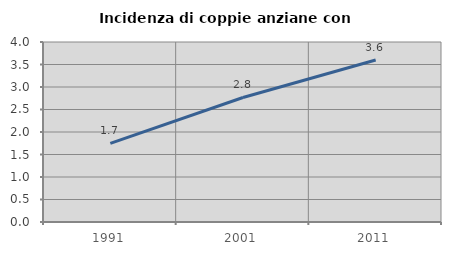
| Category | Incidenza di coppie anziane con figli |
|---|---|
| 1991.0 | 1.747 |
| 2001.0 | 2.767 |
| 2011.0 | 3.6 |